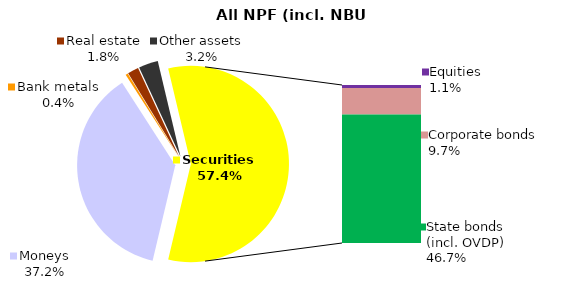
| Category | All NPF (incl. NBU CNPF)* |
|---|---|
| Moneys | 923.9 |
| Bank metals | 9.7 |
| Real estate | 45.1 |
| Other assets | 79.5 |
| Equities | 26.3 |
| Corporate bonds | 240.3 |
| Municipal bonds | 0 |
| State bonds (incl. OVDP) | 1160.4 |